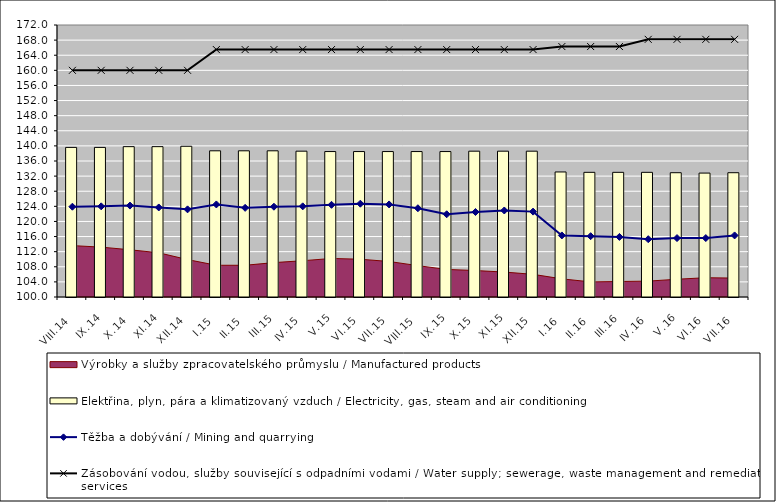
| Category | Elektřina, plyn, pára a klimatizovaný vzduch / Electricity, gas, steam and air conditioning |
|---|---|
| VIII.14 | 139.6 |
| IX.14 | 139.6 |
| X.14 | 139.8 |
| XI.14 | 139.8 |
| XII.14 | 139.9 |
| I.15 | 138.7 |
| II.15 | 138.7 |
| III.15 | 138.7 |
| IV.15 | 138.6 |
| V.15 | 138.5 |
| VI.15 | 138.5 |
| VII.15 | 138.5 |
| VIII.15 | 138.5 |
| IX.15 | 138.5 |
| X.15 | 138.6 |
| XI.15 | 138.6 |
| XII.15 | 138.6 |
| I.16 | 133.1 |
| II.16 | 133 |
| III.16 | 133 |
| IV.16 | 133 |
| V.16 | 132.9 |
| VI.16 | 132.8 |
| VII.16 | 132.9 |